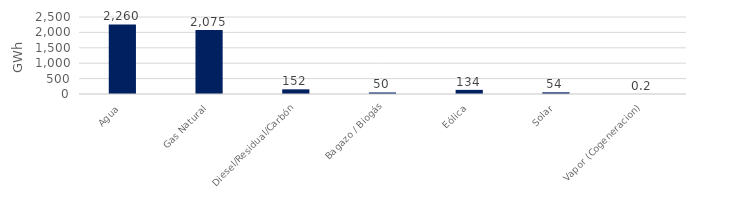
| Category | Series 0 |
|---|---|
| Agua | 2259.647 |
| Gas Natural | 2074.889 |
| Diesel/Residual/Carbón | 151.737 |
| Bagazo / Biogás | 49.721 |
| Eólica | 134.189 |
| Solar | 54.263 |
| Vapor (Cogeneracion) | 0.217 |